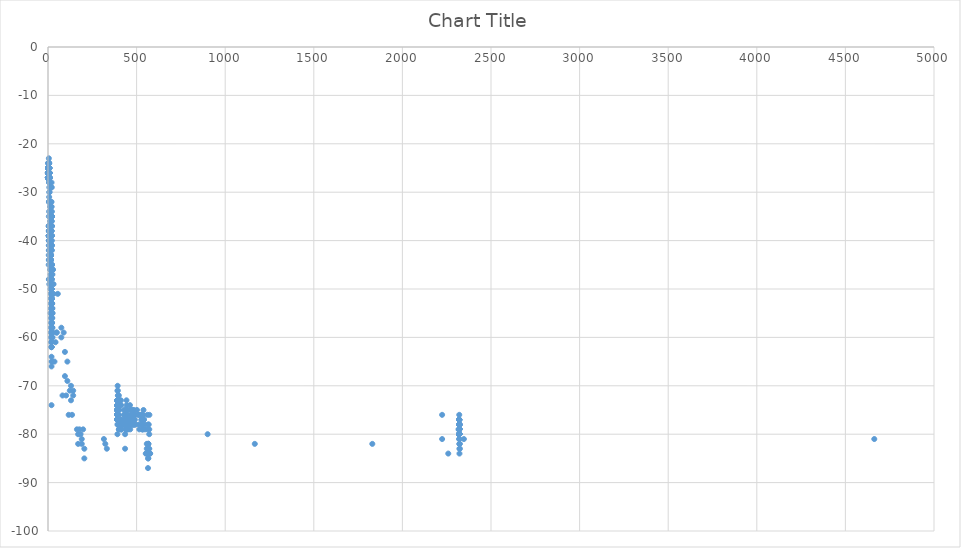
| Category | Series 0 |
|---|---|
| 0.0 | -27 |
| 0.0 | -27 |
| 0.0 | -27 |
| 0.0 | -27 |
| 0.0 | -27 |
| 0.0 | -27 |
| 0.0 | -27 |
| 0.0 | -27 |
| 0.0 | -27 |
| 0.0 | -27 |
| 0.0 | -27 |
| 0.0 | -27 |
| 0.0 | -27 |
| 0.0 | -27 |
| 0.0 | -27 |
| 0.0 | -27 |
| 0.0 | -27 |
| 0.0 | -27 |
| 0.0 | -27 |
| 0.0 | -27 |
| 0.0 | -27 |
| 0.0 | -27 |
| 0.0 | -27 |
| 0.0 | -27 |
| 0.0 | -27 |
| 0.0 | -27 |
| 0.0 | -27 |
| 0.0 | -27 |
| 0.0 | -27 |
| 0.0 | -27 |
| 0.0 | -27 |
| 0.0 | -27 |
| 0.0 | -27 |
| 0.0 | -27 |
| 0.0 | -27 |
| 0.0 | -27 |
| 0.0 | -27 |
| 0.0 | -27 |
| 0.0 | -27 |
| 0.0 | -27 |
| 0.0 | -27 |
| 0.0 | -27 |
| 0.0 | -27 |
| 0.0 | -27 |
| 0.0 | -27 |
| 0.0 | -27 |
| 0.0 | -27 |
| 0.0 | -27 |
| 0.0 | -27 |
| 0.0 | -27 |
| 0.0 | -27 |
| 0.0 | -27 |
| 0.0 | -27 |
| 0.0 | -27 |
| 0.0 | -27 |
| 0.0 | -27 |
| 0.0 | -26 |
| 0.0 | -26 |
| 0.0 | -26 |
| 0.0 | -26 |
| 0.0 | -26 |
| 0.0 | -26 |
| 0.0 | -26 |
| 0.0 | -26 |
| 0.0 | -26 |
| 0.0 | -26 |
| 0.0 | -26 |
| 0.0 | -26 |
| 0.0 | -26 |
| 0.0 | -26 |
| 0.0 | -26 |
| 0.0 | -26 |
| 0.0 | -26 |
| 0.0 | -26 |
| 0.0 | -26 |
| 0.0 | -26 |
| 0.0 | -26 |
| 0.0 | -26 |
| 0.0 | -26 |
| 0.0 | -26 |
| 0.0 | -26 |
| 0.0 | -26 |
| 0.0 | -25 |
| 0.0 | -24 |
| 0.11613462736197669 | -27 |
| 0.11613462736197669 | -27 |
| 0.11613462736197669 | -27 |
| 0.11613462736197669 | -27 |
| 0.11613462736197669 | -27 |
| 0.11613462736197669 | -27 |
| 0.11613462736197669 | -27 |
| 0.11613462736197669 | -27 |
| 0.11613462736197669 | -27 |
| 0.11613462736197669 | -27 |
| 0.11613462736197669 | -27 |
| 0.11613462736197669 | -27 |
| 0.11613462736197669 | -27 |
| 0.11613462736197669 | -27 |
| 0.11613462736197669 | -27 |
| 0.11613462736197669 | -27 |
| 0.11613462736197669 | -27 |
| 0.11613462736197669 | -27 |
| 0.11613462736197669 | -27 |
| 0.11613462736197669 | -27 |
| 0.11613462736197669 | -27 |
| 0.11613462736197669 | -27 |
| 0.11613462736197669 | -27 |
| 0.11613462736197669 | -27 |
| 0.11613462736197669 | -26 |
| 0.11613462736197669 | -25 |
| 0.11613462736197669 | -25 |
| 0.23226925472588353 | -27 |
| 0.23226925472588353 | -27 |
| 0.23226925472588353 | -27 |
| 0.23226925472588353 | -27 |
| 0.23226925472588353 | -27 |
| 0.23226925472588353 | -27 |
| 0.23226925472588353 | -27 |
| 0.23226925472588353 | -27 |
| 0.23226925472588353 | -27 |
| 0.23226925472588353 | -27 |
| 0.23226925472588353 | -27 |
| 0.23226925472588353 | -27 |
| 0.23226925472588353 | -27 |
| 0.23226925472588353 | -27 |
| 0.23226925472588353 | -26 |
| 0.23226925472588353 | -26 |
| 0.23226925472588353 | -26 |
| 0.23226925472588353 | -26 |
| 0.23226925472588353 | -26 |
| 0.23226925472588353 | -26 |
| 0.3484038820897904 | -27 |
| 0.3484038820897904 | -27 |
| 0.3484038820897904 | -27 |
| 0.3484038820897904 | -27 |
| 0.3484038820897904 | -27 |
| 0.3484038820897904 | -27 |
| 0.3484038820897904 | -27 |
| 0.3484038820897904 | -27 |
| 0.3484038820897904 | -27 |
| 0.3484038820897904 | -27 |
| 0.3484038820897904 | -27 |
| 0.3484038820897904 | -27 |
| 0.3484038820897904 | -27 |
| 0.3484038820897904 | -27 |
| 0.3484038820897904 | -27 |
| 0.3484038820897904 | -27 |
| 0.3484038820897904 | -27 |
| 0.3484038820897904 | -27 |
| 0.3484038820897904 | -27 |
| 0.3484038820897904 | -27 |
| 0.3484038820897904 | -27 |
| 0.3484038820897904 | -27 |
| 0.3484038820897904 | -27 |
| 0.3484038820897904 | -27 |
| 0.3484038820897904 | -27 |
| 0.3484038820897904 | -27 |
| 0.3484038820897904 | -27 |
| 0.3484038820897904 | -27 |
| 0.3484038820897904 | -27 |
| 0.3484038820897904 | -27 |
| 0.3484038820897904 | -27 |
| 0.3484038820897904 | -27 |
| 0.3484038820897904 | -27 |
| 0.3484038820897904 | -27 |
| 0.3484038820897904 | -27 |
| 0.3484038820897904 | -27 |
| 0.3484038820897904 | -27 |
| 0.3484038820897904 | -27 |
| 0.3484038820897904 | -27 |
| 0.3484038820897904 | -27 |
| 0.3484038820897904 | -27 |
| 0.3484038820897904 | -27 |
| 0.3484038820897904 | -27 |
| 0.3484038820897904 | -26 |
| 0.3484038820897904 | -26 |
| 0.3484038820897904 | -26 |
| 0.3484038820897904 | -26 |
| 0.3484038820897904 | -26 |
| 0.3484038820897904 | -26 |
| 0.3484038820897904 | -26 |
| 0.3484038820897904 | -26 |
| 0.3484038820897904 | -26 |
| 0.3484038820897904 | -26 |
| 0.3484038820897904 | -26 |
| 0.3484038820897904 | -25 |
| 0.3484038820897904 | -25 |
| 0.3484038820897904 | -25 |
| 0.3484038820897904 | -25 |
| 0.4638430925218141 | -27 |
| 0.4638430925218141 | -27 |
| 0.4638430925218141 | -27 |
| 0.4638430925218141 | -27 |
| 0.4638430925218141 | -27 |
| 0.4638430925218141 | -27 |
| 0.4638430925218141 | -27 |
| 0.4638430925218141 | -27 |
| 0.4638430925218141 | -27 |
| 0.4638430925218141 | -27 |
| 0.4638430925218141 | -27 |
| 0.4638430925218141 | -27 |
| 0.4638430925218141 | -27 |
| 0.4638430925218141 | -27 |
| 0.4638430925218141 | -27 |
| 0.4638430925218141 | -27 |
| 0.4638430925218141 | -27 |
| 0.4638430925218141 | -27 |
| 0.4638430925218141 | -27 |
| 0.4638430925218141 | -27 |
| 0.4638430925218141 | -27 |
| 0.4638430925218141 | -27 |
| 0.4638430925218141 | -27 |
| 0.4638430925218141 | -27 |
| 0.4638430925218141 | -27 |
| 0.4638430925218141 | -26 |
| 0.4638430925218141 | -26 |
| 0.4638430925218141 | -26 |
| 0.4638430925218141 | -26 |
| 0.4638430925218141 | -26 |
| 0.4638430925218141 | -26 |
| 0.4638430925218141 | -26 |
| 0.4638430925218141 | -26 |
| 0.4638430925218141 | -25 |
| 0.966934473998409 | -27 |
| 0.966934473998409 | -27 |
| 0.966934473998409 | -27 |
| 0.966934473998409 | -27 |
| 0.966934473998409 | -27 |
| 0.966934473998409 | -27 |
| 0.966934473998409 | -27 |
| 0.966934473998409 | -27 |
| 0.966934473998409 | -26 |
| 0.966934473998409 | -26 |
| 0.966934473998409 | -26 |
| 1.0273168104516566 | -27 |
| 1.0273168104516566 | -27 |
| 1.0273168104516566 | -27 |
| 1.0273168104516566 | -27 |
| 1.0273168104516566 | -27 |
| 1.0273168104516566 | -27 |
| 1.0273168104516566 | -27 |
| 1.0273168104516566 | -27 |
| 1.0273168104516566 | -27 |
| 1.0273168104516566 | -27 |
| 1.0273168104516566 | -27 |
| 1.0273168104516566 | -27 |
| 1.0273168104516566 | -27 |
| 1.0273168104516566 | -27 |
| 1.0273168104516566 | -27 |
| 1.0273168104516566 | -27 |
| 1.0273168104516566 | -27 |
| 1.0273168104516566 | -27 |
| 1.0273168104516566 | -27 |
| 1.0273168104516566 | -27 |
| 1.0273168104516566 | -27 |
| 1.0273168104516566 | -27 |
| 1.0273168104516566 | -27 |
| 1.0273168104516566 | -27 |
| 1.0273168104516566 | -27 |
| 1.0273168104516566 | -27 |
| 1.0273168104516566 | -27 |
| 1.0273168104516566 | -27 |
| 1.0273168104516566 | -27 |
| 1.0273168104516566 | -27 |
| 1.0273168104516566 | -27 |
| 1.0273168104516566 | -27 |
| 1.0273168104516566 | -27 |
| 1.0273168104516566 | -27 |
| 1.0273168104516566 | -27 |
| 1.0273168104516566 | -27 |
| 1.0273168104516566 | -27 |
| 1.0273168104516566 | -27 |
| 1.0273168104516566 | -27 |
| 1.0273168104516566 | -26 |
| 1.0273168104516566 | -26 |
| 1.0273168104516566 | -26 |
| 1.0273168104516566 | -26 |
| 1.0273168104516566 | -26 |
| 1.0273168104516566 | -26 |
| 1.0273168104516566 | -26 |
| 1.0273168104516566 | -26 |
| 1.0273168104516566 | -26 |
| 1.0273168104516566 | -26 |
| 1.0273168104516566 | -26 |
| 1.0273168104516566 | -26 |
| 1.0273168104516566 | -26 |
| 1.0273168104516566 | -26 |
| 1.0273168104516566 | -26 |
| 1.0273168104516566 | -25 |
| 1.0970034297552893 | -27 |
| 1.0970034297552893 | -27 |
| 1.0970034297552893 | -27 |
| 1.0970034297552893 | -27 |
| 1.0970034297552893 | -27 |
| 1.0970034297552893 | -27 |
| 1.0970034297552893 | -27 |
| 1.0970034297552893 | -27 |
| 1.0970034297552893 | -27 |
| 1.0970034297552893 | -27 |
| 1.0970034297552893 | -27 |
| 1.0970034297552893 | -27 |
| 1.0970034297552893 | -27 |
| 1.0970034297552893 | -27 |
| 1.0970034297552893 | -27 |
| 1.0970034297552893 | -27 |
| 1.0970034297552893 | -27 |
| 1.0970034297552893 | -27 |
| 1.0970034297552893 | -27 |
| 1.0970034297552893 | -26 |
| 1.0970034297552893 | -26 |
| 1.0970034297552893 | -26 |
| 1.0970034297552893 | -26 |
| 1.0970034297552893 | -25 |
| 1.1740646147548526 | -27 |
| 1.1740646147548526 | -27 |
| 1.1740646147548526 | -27 |
| 1.1740646147548526 | -27 |
| 1.1740646147548526 | -27 |
| 1.1740646147548526 | -27 |
| 1.1740646147548526 | -27 |
| 1.1740646147548526 | -27 |
| 1.1740646147548526 | -27 |
| 1.1740646147548526 | -27 |
| 1.1740646147548526 | -27 |
| 1.1740646147548526 | -27 |
| 1.1740646147548526 | -27 |
| 1.1740646147548526 | -27 |
| 1.1740646147548526 | -27 |
| 1.1740646147548526 | -27 |
| 1.1740646147548526 | -27 |
| 1.1740646147548526 | -27 |
| 1.1740646147548526 | -27 |
| 1.1740646147548526 | -27 |
| 1.1740646147548526 | -27 |
| 1.1740646147548526 | -27 |
| 1.1740646147548526 | -27 |
| 1.1740646147548526 | -27 |
| 1.1740646147548526 | -27 |
| 1.1740646147548526 | -26 |
| 1.1740646147548526 | -26 |
| 1.1740646147548526 | -26 |
| 1.1740646147548526 | -26 |
| 1.1740646147548526 | -26 |
| 1.1740646147548526 | -26 |
| 1.1740646147548526 | -26 |
| 1.1740646147548526 | -25 |
| 1.2566318632224815 | -27 |
| 1.2566318632224815 | -27 |
| 1.2566318632224815 | -27 |
| 1.2566318632224815 | -27 |
| 1.2566318632224815 | -27 |
| 1.2566318632224815 | -27 |
| 1.2566318632224815 | -27 |
| 1.2566318632224815 | -27 |
| 1.2566318632224815 | -27 |
| 1.2566318632224815 | -27 |
| 1.2566318632224815 | -27 |
| 1.2566318632224815 | -27 |
| 1.2566318632224815 | -27 |
| 1.2566318632224815 | -27 |
| 1.2566318632224815 | -26 |
| 1.2566318632224815 | -26 |
| 1.2566318632224815 | -26 |
| 1.2566318632224815 | -26 |
| 1.2566318632224815 | -26 |
| 1.2566318632224815 | -26 |
| 1.2566318632224815 | -26 |
| 1.2566318632224815 | -25 |
| 1.3445900149015872 | -27 |
| 1.3445900149015872 | -27 |
| 1.3445900149015872 | -27 |
| 1.3445900149015872 | -27 |
| 1.3445900149015872 | -27 |
| 1.3445900149015872 | -27 |
| 1.3445900149015872 | -27 |
| 1.3445900149015872 | -27 |
| 1.3445900149015872 | -27 |
| 1.3445900149015872 | -27 |
| 1.3445900149015872 | -27 |
| 1.3445900149015872 | -27 |
| 1.3445900149015872 | -27 |
| 1.3445900149015872 | -27 |
| 1.3445900149015872 | -27 |
| 1.3445900149015872 | -27 |
| 1.3445900149015872 | -27 |
| 1.3445900149015872 | -27 |
| 1.3445900149015872 | -27 |
| 1.3445900149015872 | -27 |
| 1.3445900149015872 | -27 |
| 1.3445900149015872 | -27 |
| 1.3445900149015872 | -27 |
| 1.3445900149015872 | -27 |
| 1.3445900149015872 | -27 |
| 1.3445900149015872 | -27 |
| 1.3445900149015872 | -27 |
| 1.3445900149015872 | -27 |
| 1.3445900149015872 | -27 |
| 1.3445900149015872 | -27 |
| 1.3445900149015872 | -27 |
| 1.3445900149015872 | -27 |
| 1.3445900149015872 | -27 |
| 1.3445900149015872 | -27 |
| 1.3445900149015872 | -27 |
| 1.3445900149015872 | -27 |
| 1.3445900149015872 | -27 |
| 1.3445900149015872 | -27 |
| 1.3445900149015872 | -27 |
| 1.3445900149015872 | -27 |
| 1.3445900149015872 | -27 |
| 1.3445900149015872 | -27 |
| 1.3445900149015872 | -27 |
| 1.3445900149015872 | -27 |
| 1.3445900149015872 | -27 |
| 1.3445900149015872 | -27 |
| 1.3445900149015872 | -27 |
| 1.3445900149015872 | -27 |
| 1.3445900149015872 | -27 |
| 1.3445900149015872 | -27 |
| 1.3445900149015872 | -27 |
| 1.3445900149015872 | -27 |
| 1.3445900149015872 | -27 |
| 1.3445900149015872 | -27 |
| 1.3445900149015872 | -27 |
| 1.3445900149015872 | -26 |
| 1.3445900149015872 | -26 |
| 1.3445900149015872 | -26 |
| 1.3445900149015872 | -26 |
| 1.3445900149015872 | -26 |
| 1.3445900149015872 | -26 |
| 1.3445900149015872 | -26 |
| 1.3445900149015872 | -26 |
| 1.3445900149015872 | -26 |
| 1.3445900149015872 | -26 |
| 1.3445900149015872 | -26 |
| 1.3445900149015872 | -26 |
| 1.3445900149015872 | -26 |
| 1.3445900149015872 | -26 |
| 1.3445900149015872 | -26 |
| 1.3445900149015872 | -26 |
| 1.3445900149015872 | -26 |
| 1.3445900149015872 | -26 |
| 1.3445900149015872 | -26 |
| 1.3445900149015872 | -26 |
| 1.3445900149015872 | -26 |
| 1.3445900149015872 | -26 |
| 1.3445900149015872 | -26 |
| 1.3445900149015872 | -26 |
| 1.3445900149015872 | -26 |
| 1.3445900149015872 | -25 |
| 1.3445900149015872 | -25 |
| 1.3445900149015872 | -25 |
| 1.4365568125013888 | -27 |
| 1.4365568125013888 | -27 |
| 1.4365568125013888 | -27 |
| 1.4365568125013888 | -27 |
| 1.4365568125013888 | -27 |
| 1.4365568125013888 | -27 |
| 1.4365568125013888 | -27 |
| 1.4365568125013888 | -27 |
| 1.4365568125013888 | -27 |
| 1.4365568125013888 | -27 |
| 1.4365568125013888 | -27 |
| 1.4365568125013888 | -27 |
| 1.4365568125013888 | -27 |
| 1.4365568125013888 | -27 |
| 1.4365568125013888 | -27 |
| 1.4365568125013888 | -27 |
| 1.4365568125013888 | -27 |
| 1.4365568125013888 | -27 |
| 1.4365568125013888 | -27 |
| 1.4365568125013888 | -27 |
| 1.4365568125013888 | -27 |
| 1.4365568125013888 | -26 |
| 1.4365568125013888 | -26 |
| 1.4365568125013888 | -26 |
| 1.4365568125013888 | -26 |
| 1.4365568125013888 | -26 |
| 1.4365568125013888 | -26 |
| 1.4365568125013888 | -26 |
| 1.4365568125013888 | -26 |
| 1.4365568125013888 | -26 |
| 1.4365568125013888 | -26 |
| 1.4365568125013888 | -26 |
| 1.4365568125013888 | -26 |
| 1.4365568125013888 | -26 |
| 1.4365568125013888 | -25 |
| 1.5318104131302868 | -27 |
| 1.5318104131302868 | -27 |
| 2.1227054827104457 | -27 |
| 2.1227054827104457 | -27 |
| 2.1227054827104457 | -27 |
| 2.1227054827104457 | -27 |
| 2.1227054827104457 | -27 |
| 2.1227054827104457 | -27 |
| 2.1227054827104457 | -27 |
| 2.1227054827104457 | -27 |
| 2.1227054827104457 | -27 |
| 2.1227054827104457 | -27 |
| 2.1227054827104457 | -27 |
| 2.1227054827104457 | -26 |
| 2.1227054827104457 | -26 |
| 2.1227054827104457 | -26 |
| 2.1227054827104457 | -26 |
| 2.1227054827104457 | -26 |
| 2.1227054827104457 | -26 |
| 2.1940067862653345 | -27 |
| 2.1940067862653345 | -27 |
| 2.1940067862653345 | -27 |
| 2.1940067862653345 | -27 |
| 2.1940067862653345 | -27 |
| 2.1940067862653345 | -27 |
| 2.1940067862653345 | -27 |
| 2.1940067862653345 | -27 |
| 2.1940067862653345 | -27 |
| 2.1940067862653345 | -27 |
| 2.1940067862653345 | -27 |
| 2.1940067862653345 | -27 |
| 2.1940067862653345 | -27 |
| 2.1940067862653345 | -27 |
| 2.1940067862653345 | -26 |
| 2.1940067862653345 | -26 |
| 2.1940067862653345 | -25 |
| 2.1940067862653345 | -24 |
| 2.2689436757611308 | -27 |
| 2.2689436757611308 | -27 |
| 2.2689436757611308 | -26 |
| 2.2689436757611308 | -26 |
| 2.2689436757611308 | -26 |
| 2.2689436757611308 | -26 |
| 2.2689436757611308 | -26 |
| 2.2689436757611308 | -26 |
| 2.2689436757611308 | -25 |
| 2.3476484954825767 | -27 |
| 2.3476484954825767 | -27 |
| 2.3476484954825767 | -27 |
| 2.3476484954825767 | -27 |
| 2.3476484954825767 | -27 |
| 2.3476484954825767 | -27 |
| 2.3476484954825767 | -27 |
| 2.3476484954825767 | -27 |
| 2.3476484954825767 | -26 |
| 2.3476484954825767 | -26 |
| 2.3476484954825767 | -26 |
| 2.4293571181053197 | -27 |
| 2.4293571181053197 | -27 |
| 2.4293571181053197 | -27 |
| 2.4293571181053197 | -27 |
| 2.4293571181053197 | -27 |
| 2.4293571181053197 | -27 |
| 2.4293571181053197 | -27 |
| 2.4293571181053197 | -27 |
| 2.4293571181053197 | -26 |
| 2.4293571181053197 | -26 |
| 2.4293571181053197 | -26 |
| 2.5137766509002746 | -27 |
| 2.5137766509002746 | -27 |
| 2.5137766509002746 | -27 |
| 2.5137766509002746 | -27 |
| 2.5137766509002746 | -27 |
| 2.5137766509002746 | -26 |
| 2.5137766509002746 | -26 |
| 2.5137766509002746 | -26 |
| 2.5137766509002746 | -26 |
| 2.5137766509002746 | -25 |
| 2.600643110525304 | -27 |
| 2.600643110525304 | -27 |
| 2.600643110525304 | -27 |
| 2.600643110525304 | -27 |
| 2.600643110525304 | -27 |
| 2.600643110525304 | -27 |
| 2.600643110525304 | -27 |
| 2.600643110525304 | -27 |
| 2.600643110525304 | -26 |
| 2.600643110525304 | -26 |
| 2.600643110525304 | -26 |
| 2.689719431542304 | -27 |
| 2.689719431542304 | -27 |
| 2.689719431542304 | -27 |
| 2.689719431542304 | -27 |
| 2.689719431542304 | -27 |
| 2.689719431542304 | -27 |
| 2.689719431542304 | -27 |
| 2.689719431542304 | -27 |
| 2.689719431542304 | -27 |
| 2.689719431542304 | -26 |
| 2.689719431542304 | -26 |
| 2.689719431542304 | -26 |
| 2.689719431542304 | -25 |
| 2.7796915016768575 | -27 |
| 2.7796915016768575 | -27 |
| 2.7796915016768575 | -27 |
| 2.7796915016768575 | -27 |
| 2.7796915016768575 | -27 |
| 2.7796915016768575 | -27 |
| 2.7796915016768575 | -27 |
| 2.7796915016768575 | -26 |
| 2.7796915016768575 | -26 |
| 2.7796915016768575 | -26 |
| 2.8725523176289207 | -27 |
| 2.8725523176289207 | -27 |
| 2.8725523176289207 | -27 |
| 2.8725523176289207 | -27 |
| 2.8725523176289207 | -27 |
| 2.8725523176289207 | -27 |
| 2.8725523176289207 | -27 |
| 2.8725523176289207 | -27 |
| 2.8725523176289207 | -26 |
| 2.8725523176289207 | -26 |
| 2.8725523176289207 | -25 |
| 2.9670529629429976 | -27 |
| 2.9670529629429976 | -27 |
| 2.9670529629429976 | -27 |
| 2.9670529629429976 | -27 |
| 2.9670529629429976 | -27 |
| 2.9670529629429976 | -27 |
| 2.9670529629429976 | -27 |
| 2.9670529629429976 | -27 |
| 2.9670529629429976 | -27 |
| 2.9670529629429976 | -27 |
| 2.9670529629429976 | -26 |
| 2.9670529629429976 | -26 |
| 2.9670529629429976 | -26 |
| 3.0630416658435307 | -27 |
| 3.0630416658435307 | -27 |
| 3.0630416658435307 | -27 |
| 3.0630416658435307 | -27 |
| 3.0630416658435307 | -27 |
| 3.0630416658435307 | -27 |
| 3.0630416658435307 | -27 |
| 3.0630416658435307 | -27 |
| 3.0630416658435307 | -27 |
| 3.0630416658435307 | -27 |
| 3.0630416658435307 | -27 |
| 3.0630416658435307 | -26 |
| 3.0630416658435307 | -26 |
| 3.0630416658435307 | -26 |
| 3.0630416658435307 | -26 |
| 3.0630416658435307 | -26 |
| 3.160382841185604 | -27 |
| 3.160382841185604 | -27 |
| 3.160382841185604 | -27 |
| 3.160382841185604 | -27 |
| 3.160382841185604 | -27 |
| 3.160382841185604 | -27 |
| 3.160382841185604 | -27 |
| 3.160382841185604 | -27 |
| 3.160382841185604 | -27 |
| 3.160382841185604 | -26 |
| 3.160382841185604 | -26 |
| 3.160382841185604 | -26 |
| 3.160382841185604 | -26 |
| 3.160382841185604 | -26 |
| 3.2589553009206402 | -27 |
| 3.2589553009206402 | -27 |
| 3.2589553009206402 | -26 |
| 3.2589553009206402 | -26 |
| 3.7801409451632164 | -27 |
| 3.8574074446203808 | -27 |
| 3.8574074446203808 | -27 |
| 3.8768300193587772 | -27 |
| 3.8768300193587772 | -26 |
| 4.0298592462030065 | -45 |
| 4.0298592462030065 | -37 |
| 4.033769641331597 | -25 |
| 4.124517217391539 | -27 |
| 4.124517217391539 | -27 |
| 4.216510586216692 | -24 |
| 4.257203479768284 | -43 |
| 4.403921376187348 | -27 |
| 4.485052443775963 | -39 |
| 4.485052443775963 | -39 |
| 4.498622747954434 | -27 |
| 4.498622747954434 | -27 |
| 4.503688320464772 | -41 |
| 4.503688320464772 | -38 |
| 4.5765647197385375 | -27 |
| 4.599142763904997 | -44 |
| 4.599142763904997 | -37 |
| 4.690229249807549 | -27 |
| 4.690229249807549 | -27 |
| 4.690229249807549 | -27 |
| 4.7119648313565445 | -40 |
| 4.7119648313565445 | -39 |
| 4.719652683226004 | -42 |
| 4.783608476488872 | -39 |
| 4.788190734162122 | -40 |
| 4.788190734162122 | -26 |
| 4.807598837282424 | -27 |
| 4.807598837282424 | -27 |
| 4.807598837282424 | -27 |
| 4.807598837282424 | -26 |
| 4.807598837282424 | -26 |
| 4.807598837282424 | -26 |
| 4.807598837282424 | -26 |
| 4.807598837282424 | -23 |
| 4.8262459301134255 | -39 |
| 4.828202530241875 | -37 |
| 4.828202530241875 | -35 |
| 4.836915809873251 | -27 |
| 4.836915809873251 | -27 |
| 4.836915809873251 | -27 |
| 4.836915809873251 | -27 |
| 4.836915809873251 | -27 |
| 4.836915809873251 | -27 |
| 4.836915809873251 | -27 |
| 4.836915809873251 | -27 |
| 4.836915809873251 | -27 |
| 4.836915809873251 | -27 |
| 4.836915809873251 | -27 |
| 4.836915809873251 | -27 |
| 4.836915809873251 | -27 |
| 4.836915809873251 | -27 |
| 4.836915809873251 | -27 |
| 4.836915809873251 | -27 |
| 4.836915809873251 | -27 |
| 4.836915809873251 | -27 |
| 4.836915809873251 | -27 |
| 4.836915809873251 | -27 |
| 4.836915809873251 | -27 |
| 4.836915809873251 | -27 |
| 4.836915809873251 | -27 |
| 4.836915809873251 | -27 |
| 4.836915809873251 | -27 |
| 4.836915809873251 | -27 |
| 4.836915809873251 | -27 |
| 4.836915809873251 | -27 |
| 4.836915809873251 | -27 |
| 4.836915809873251 | -27 |
| 4.836915809873251 | -27 |
| 4.836915809873251 | -27 |
| 4.836915809873251 | -27 |
| 4.836915809873251 | -27 |
| 4.836915809873251 | -27 |
| 4.836915809873251 | -27 |
| 4.836915809873251 | -27 |
| 4.836915809873251 | -27 |
| 4.836915809873251 | -27 |
| 4.836915809873251 | -27 |
| 4.836915809873251 | -27 |
| 4.836915809873251 | -27 |
| 4.836915809873251 | -27 |
| 4.836915809873251 | -27 |
| 4.836915809873251 | -27 |
| 4.836915809873251 | -27 |
| 4.836915809873251 | -27 |
| 4.836915809873251 | -27 |
| 4.836915809873251 | -27 |
| 4.836915809873251 | -27 |
| 4.836915809873251 | -27 |
| 4.836915809873251 | -27 |
| 4.836915809873251 | -27 |
| 4.836915809873251 | -27 |
| 4.836915809873251 | -27 |
| 4.836915809873251 | -27 |
| 4.836915809873251 | -27 |
| 4.836915809873251 | -27 |
| 4.836915809873251 | -27 |
| 4.836915809873251 | -27 |
| 4.836915809873251 | -27 |
| 4.836915809873251 | -27 |
| 4.836915809873251 | -27 |
| 4.836915809873251 | -27 |
| 4.836915809873251 | -26 |
| 4.836915809873251 | -26 |
| 4.836915809873251 | -26 |
| 4.836915809873251 | -26 |
| 4.836915809873251 | -26 |
| 4.836915809873251 | -26 |
| 4.836915809873251 | -26 |
| 4.836915809873251 | -26 |
| 4.836915809873251 | -26 |
| 4.836915809873251 | -26 |
| 4.836915809873251 | -26 |
| 4.836915809873251 | -26 |
| 4.836915809873251 | -26 |
| 4.836915809873251 | -26 |
| 4.836915809873251 | -26 |
| 4.836915809873251 | -26 |
| 4.836915809873251 | -26 |
| 4.836915809873251 | -26 |
| 4.836915809873251 | -26 |
| 4.836915809873251 | -26 |
| 4.836915809873251 | -26 |
| 4.836915809873251 | -26 |
| 4.836915809873251 | -26 |
| 4.836915809873251 | -26 |
| 4.836915809873251 | -26 |
| 4.836915809873251 | -26 |
| 4.836915809873251 | -26 |
| 4.836915809873251 | -26 |
| 4.836915809873251 | -26 |
| 4.836915809873251 | -26 |
| 4.836915809873251 | -26 |
| 4.836915809873251 | -26 |
| 4.836915809873251 | -26 |
| 4.836915809873251 | -26 |
| 4.836915809873251 | -26 |
| 4.836915809873251 | -26 |
| 4.836915809873251 | -26 |
| 4.836915809873251 | -26 |
| 4.836915809873251 | -26 |
| 4.836915809873251 | -26 |
| 4.836915809873251 | -26 |
| 4.836915809873251 | -26 |
| 4.836915809873251 | -26 |
| 4.836915809873251 | -26 |
| 4.836915809873251 | -26 |
| 4.836915809873251 | -26 |
| 4.836915809873251 | -26 |
| 4.836915809873251 | -26 |
| 4.836915809873251 | -25 |
| 4.836915809873251 | -25 |
| 4.867223095301796 | -39 |
| 4.886948443309584 | -26 |
| 4.886948443309584 | -26 |
| 4.902854494014818 | -25 |
| 4.940614194774649 | -39 |
| 4.940614194774649 | -39 |
| 4.986455069318477 | -27 |
| 4.992872273241673 | -27 |
| 4.992872273241673 | -26 |
| 5.0450056216269825 | -38 |
| 5.055063002984746 | -37 |
| 5.055063819231758 | -48 |
| 5.055063819231758 | -40 |
| 5.08666666088886 | -39 |
| 5.08666666088886 | -27 |
| 5.169587841114874 | -26 |
| 5.169587841114874 | -26 |
| 5.2028181965479305 | -26 |
| 5.209744472640164 | -32 |
| 5.209744472640164 | -32 |
| 5.284182168069767 | -26 |
| 5.288237047169722 | -27 |
| 5.288237047169722 | -27 |
| 5.288237047169722 | -26 |
| 5.30908058701891 | -26 |
| 5.30908058701891 | -24 |
| 5.331066187823553 | -27 |
| 5.331066187823553 | -27 |
| 5.331066187823553 | -26 |
| 5.389910710123769 | -39 |
| 5.389910710123769 | -38 |
| 5.398155547897567 | -26 |
| 5.398155547897567 | -25 |
| 5.415748395848854 | -27 |
| 5.415748395848854 | -27 |
| 5.5626400256213815 | -24 |
| 5.740940336674183 | -25 |
| 5.744542906482917 | -27 |
| 5.744542906482917 | -26 |
| 5.838648559887481 | -27 |
| 5.844732633262492 | -48 |
| 5.856686766952914 | -27 |
| 5.856686766952914 | -27 |
| 5.856686766952914 | -27 |
| 5.856686766952914 | -26 |
| 5.933534805894837 | -27 |
| 5.933534805894837 | -27 |
| 5.933534805894837 | -27 |
| 5.933534805894837 | -26 |
| 5.970931700889894 | -27 |
| 5.970931700889894 | -27 |
| 5.970931700889894 | -26 |
| 5.970931700889894 | -26 |
| 5.970931700889894 | -26 |
| 5.970931700889894 | -26 |
| 5.970931700889894 | -26 |
| 6.02916479000809 | -27 |
| 6.02916479000809 | -27 |
| 6.02916479000809 | -27 |
| 6.02916479000809 | -26 |
| 6.02916479000809 | -26 |
| 6.085910337588555 | -26 |
| 6.085910337588555 | -26 |
| 6.085910337588555 | -26 |
| 6.085911329119763 | -44 |
| 6.085911329119763 | -34 |
| 6.125503679109165 | -27 |
| 6.125503679109165 | -27 |
| 6.125503679109165 | -27 |
| 6.125503679109165 | -27 |
| 6.125503679109165 | -26 |
| 6.125503679109165 | -26 |
| 6.125503679109165 | -26 |
| 6.22251854685257 | -27 |
| 6.22251854685257 | -27 |
| 6.22251854685257 | -26 |
| 6.22251854685257 | -26 |
| 6.22251854685257 | -26 |
| 6.22251854685257 | -26 |
| 6.22251854685257 | -26 |
| 6.260809396365446 | -27 |
| 6.260809396365446 | -27 |
| 6.319591615636764 | -27 |
| 6.319591615636764 | -27 |
| 6.319591615636764 | -27 |
| 6.319591615636764 | -27 |
| 6.319591615636764 | -26 |
| 6.319591615636764 | -26 |
| 6.319591615636764 | -26 |
| 6.340262363245557 | -27 |
| 6.372675091524988 | -26 |
| 6.374191583302893 | -27 |
| 6.417272918915533 | -27 |
| 6.417272918915533 | -27 |
| 6.417272918915533 | -27 |
| 6.417272918915533 | -27 |
| 6.417272918915533 | -27 |
| 6.417272918915533 | -27 |
| 6.417272918915533 | -27 |
| 6.417272918915533 | -27 |
| 6.417272918915533 | -26 |
| 6.417272918915533 | -26 |
| 6.417272918915533 | -26 |
| 6.417272918915533 | -26 |
| 6.417272918915533 | -26 |
| 6.417272918915533 | -26 |
| 6.484019697903644 | -27 |
| 6.484019697903644 | -26 |
| 6.484019697903644 | -26 |
| 6.484019697903644 | -24 |
| 6.511174031442668 | -27 |
| 6.516128748537481 | -27 |
| 6.516128748537481 | -27 |
| 6.516128748537481 | -27 |
| 6.516128748537481 | -27 |
| 6.516128748537481 | -27 |
| 6.516128748537481 | -27 |
| 6.516128748537481 | -27 |
| 6.516128748537481 | -27 |
| 6.516128748537481 | -27 |
| 6.516128748537481 | -27 |
| 6.516128748537481 | -27 |
| 6.516128748537481 | -27 |
| 6.516128748537481 | -26 |
| 6.516128748537481 | -26 |
| 6.516128748537481 | -26 |
| 6.516128748537481 | -26 |
| 6.516128748537481 | -26 |
| 6.516128748537481 | -26 |
| 6.516128748537481 | -26 |
| 6.516128748537481 | -25 |
| 6.596177107398889 | -27 |
| 6.596177107398889 | -26 |
| 6.615546122927653 | -27 |
| 6.615546122927653 | -27 |
| 6.615546122927653 | -27 |
| 6.615546122927653 | -27 |
| 6.615546122927653 | -27 |
| 6.615546122927653 | -27 |
| 6.615546122927653 | -27 |
| 6.615546122927653 | -27 |
| 6.615546122927653 | -27 |
| 6.615546122927653 | -27 |
| 6.615546122927653 | -27 |
| 6.615546122927653 | -26 |
| 6.615546122927653 | -26 |
| 6.615546122927653 | -26 |
| 6.615546122927653 | -26 |
| 6.615546122927653 | -26 |
| 6.615546122927653 | -26 |
| 6.615546122927653 | -26 |
| 6.615546122927653 | -26 |
| 6.615546122927653 | -26 |
| 6.615546122927653 | -26 |
| 6.715500102530678 | -27 |
| 6.715500102530678 | -27 |
| 6.715500102530678 | -27 |
| 6.715500102530678 | -27 |
| 6.715500102530678 | -27 |
| 6.715500102530678 | -27 |
| 6.715500102530678 | -27 |
| 6.715500102530678 | -27 |
| 6.715500102530678 | -27 |
| 6.715500102530678 | -27 |
| 6.715500102530678 | -26 |
| 6.715500102530678 | -26 |
| 6.715500102530678 | -26 |
| 6.715500102530678 | -26 |
| 6.715500102530678 | -26 |
| 6.715500102530678 | -26 |
| 6.717648501933499 | -31 |
| 6.717648501933499 | -27 |
| 6.815363999380056 | -27 |
| 6.815363999380056 | -27 |
| 6.815363999380056 | -27 |
| 6.815363999380056 | -27 |
| 6.815363999380056 | -27 |
| 6.815363999380056 | -27 |
| 6.815363999380056 | -27 |
| 6.815363999380056 | -27 |
| 6.815363999380056 | -27 |
| 6.815363999380056 | -27 |
| 6.815363999380056 | -27 |
| 6.863570876209855 | -27 |
| 6.863570876209855 | -27 |
| 6.863570876209855 | -27 |
| 6.863570876209855 | -26 |
| 6.863570876209855 | -26 |
| 6.863570876209855 | -26 |
| 6.863570876209855 | -26 |
| 6.863570876209855 | -25 |
| 6.916318747247265 | -27 |
| 6.916318747247265 | -27 |
| 6.916318747247265 | -27 |
| 6.916318747247265 | -27 |
| 6.916318747247265 | -27 |
| 6.916318747247265 | -27 |
| 6.916318747247265 | -27 |
| 6.916318747247265 | -27 |
| 6.916318747247265 | -27 |
| 6.916318747247265 | -27 |
| 6.916318747247265 | -27 |
| 6.916318747247265 | -27 |
| 6.916318747247265 | -27 |
| 6.916318747247265 | -27 |
| 6.916318747247265 | -27 |
| 6.916318747247265 | -27 |
| 6.916318747247265 | -27 |
| 6.916318747247265 | -27 |
| 6.916318747247265 | -27 |
| 6.916318747247265 | -27 |
| 6.916318747247265 | -27 |
| 6.916318747247265 | -26 |
| 6.916318747247265 | -26 |
| 6.916318747247265 | -26 |
| 6.916318747247265 | -26 |
| 6.916318747247265 | -26 |
| 6.916318747247265 | -26 |
| 6.916318747247265 | -26 |
| 6.916318747247265 | -26 |
| 6.916318747247265 | -26 |
| 6.916318747247265 | -26 |
| 6.916318747247265 | -26 |
| 6.916318747247265 | -26 |
| 6.916318747247265 | -26 |
| 6.916318747247265 | -26 |
| 6.916318747247265 | -26 |
| 6.916318747247265 | -26 |
| 6.916318747247265 | -26 |
| 6.916318747247265 | -26 |
| 6.916318747247265 | -26 |
| 6.916318747247265 | -25 |
| 6.916318747247265 | -25 |
| 6.970910552495951 | -27 |
| 6.970910552495951 | -26 |
| 6.970910552495951 | -25 |
| 6.985154045335941 | -32 |
| 6.985154045335941 | -28 |
| 7.017743089371446 | -28 |
| 7.017743089371446 | -27 |
| 7.017743089371446 | -27 |
| 7.017743089371446 | -27 |
| 7.017743089371446 | -27 |
| 7.017743089371446 | -27 |
| 7.017743089371446 | -27 |
| 7.017743089371446 | -27 |
| 7.017743089371446 | -27 |
| 7.017743089371446 | -27 |
| 7.017743089371446 | -27 |
| 7.017743089371446 | -27 |
| 7.017743089371446 | -27 |
| 7.017743089371446 | -27 |
| 7.017743089371446 | -27 |
| 7.017743089371446 | -27 |
| 7.017743089371446 | -27 |
| 7.017743089371446 | -26 |
| 7.017743089371446 | -26 |
| 7.017743089371446 | -26 |
| 7.017743089371446 | -26 |
| 7.017743089371446 | -26 |
| 7.017743089371446 | -26 |
| 7.017743089371446 | -26 |
| 7.017743089371446 | -26 |
| 7.017743089371446 | -26 |
| 7.017743089371446 | -26 |
| 7.017743089371446 | -26 |
| 7.017743089371446 | -26 |
| 7.017743089371446 | -26 |
| 7.017743089371446 | -26 |
| 7.017743089371446 | -26 |
| 7.017743089371446 | -26 |
| 7.017743089371446 | -26 |
| 7.017743089371446 | -26 |
| 7.017743089371446 | -26 |
| 7.017743089371446 | -25 |
| 7.017743089371446 | -25 |
| 7.079154054859077 | -27 |
| 7.079154054859077 | -27 |
| 7.119005633751143 | -27 |
| 7.119005633751143 | -27 |
| 7.119005633751143 | -27 |
| 7.119005633751143 | -27 |
| 7.119005633751143 | -27 |
| 7.119005633751143 | -27 |
| 7.119005633751143 | -27 |
| 7.119005633751143 | -27 |
| 7.119005633751143 | -27 |
| 7.119005633751143 | -27 |
| 7.119005633751143 | -27 |
| 7.119005633751143 | -27 |
| 7.119005633751143 | -26 |
| 7.119005633751143 | -26 |
| 7.119005633751143 | -26 |
| 7.119005633751143 | -26 |
| 7.119005633751143 | -26 |
| 7.119005633751143 | -26 |
| 7.119005633751143 | -26 |
| 7.119005633751143 | -26 |
| 7.119005633751143 | -26 |
| 7.119005633751143 | -26 |
| 7.119005633751143 | -26 |
| 7.119005633751143 | -26 |
| 7.119005633751143 | -25 |
| 7.119005633751143 | -25 |
| 7.119005633751143 | -25 |
| 7.221307479622302 | -27 |
| 7.221307479622302 | -27 |
| 7.221307479622302 | -27 |
| 7.221307479622302 | -27 |
| 7.221307479622302 | -26 |
| 7.221307479622302 | -24 |
| 7.2603108666027705 | -42 |
| 7.2603108666027705 | -41 |
| 7.2603108666027705 | -27 |
| 7.2603108666027705 | -26 |
| 7.323405644006013 | -27 |
| 7.323405644006013 | -27 |
| 7.323405644006013 | -27 |
| 7.323405644006013 | -27 |
| 7.323405644006013 | -27 |
| 7.323405644006013 | -27 |
| 7.323405644006013 | -27 |
| 7.323405644006013 | -27 |
| 7.323405644006013 | -27 |
| 7.323405644006013 | -27 |
| 7.323405644006013 | -26 |
| 7.323405644006013 | -26 |
| 7.323405644006013 | -26 |
| 7.323405644006013 | -26 |
| 7.323405644006013 | -26 |
| 7.350311863044565 | -49 |
| 7.380109707974207 | -28 |
| 7.42651319095977 | -27 |
| 7.42651319095977 | -27 |
| 7.42651319095977 | -27 |
| 7.42651319095977 | -27 |
| 7.42651319095977 | -27 |
| 7.42651319095977 | -26 |
| 7.42651319095977 | -26 |
| 7.42651319095977 | -26 |
| 7.42651319095977 | -26 |
| 7.42651319095977 | -26 |
| 7.42651319095977 | -26 |
| 7.42651319095977 | -26 |
| 7.42651319095977 | -26 |
| 7.42651319095977 | -26 |
| 7.42651319095977 | -25 |
| 7.465682299901366 | -30 |
| 7.465682299901366 | -29 |
| 7.530000040488598 | -27 |
| 7.530000040488598 | -27 |
| 7.530000040488598 | -27 |
| 7.530000040488598 | -27 |
| 7.530000040488598 | -26 |
| 7.530000040488598 | -26 |
| 7.530000040488598 | -26 |
| 7.530000040488598 | -26 |
| 7.530000040488598 | -26 |
| 7.530000040488598 | -26 |
| 7.530000040488598 | -26 |
| 7.530000040488598 | -26 |
| 7.633850766776172 | -27 |
| 7.633850766776172 | -27 |
| 7.633850766776172 | -27 |
| 7.633850766776172 | -27 |
| 7.633850766776172 | -27 |
| 7.633850766776172 | -27 |
| 7.633850766776172 | -27 |
| 7.633850766776172 | -27 |
| 7.633850766776172 | -27 |
| 7.633850766776172 | -27 |
| 7.633850766776172 | -26 |
| 7.633850766776172 | -26 |
| 7.633850766776172 | -26 |
| 7.633850766776172 | -26 |
| 7.633850766776172 | -25 |
| 7.804784971603791 | -40 |
| 8.528239318051835 | -30 |
| 9.93766448220478 | -27 |
| 10.368646123304293 | -43 |
| 10.368646123304293 | -43 |
| 11.7066694626167 | -48 |
| 11.7066694626167 | -33 |
| 11.875167617710604 | -42 |
| 12.393542878383222 | -36 |
| 12.55010868863354 | -44 |
| 13.534109649805833 | -42 |
| 13.534109649805833 | -35 |
| 14.030740636609748 | -40 |
| 14.343099831028624 | -41 |
| 14.343099831028624 | -36 |
| 14.343099831028624 | -34 |
| 14.381508199952982 | -50 |
| 14.381508199952982 | -44 |
| 14.419832945802366 | -55 |
| 14.420302463979343 | -48 |
| 14.420302463979343 | -48 |
| 14.420302463979343 | -47 |
| 14.420302463979343 | -43 |
| 14.459925406966397 | -46 |
| 14.459925406966397 | -46 |
| 14.459925406966397 | -45 |
| 14.459925406966397 | -45 |
| 14.459925406966397 | -44 |
| 14.459925406966397 | -43 |
| 14.459925406966397 | -43 |
| 14.459925406966397 | -42 |
| 14.459925406966397 | -42 |
| 14.459925406966397 | -42 |
| 14.459925406966397 | -42 |
| 14.459925406966397 | -42 |
| 14.459925406966397 | -42 |
| 14.459925406966397 | -41 |
| 14.459925406966397 | -41 |
| 14.459925406966397 | -41 |
| 14.459925406966397 | -41 |
| 14.459925406966397 | -41 |
| 14.459925406966397 | -41 |
| 14.459925406966397 | -41 |
| 14.459925406966397 | -41 |
| 14.459925406966397 | -41 |
| 14.459925406966397 | -40 |
| 14.459925406966397 | -40 |
| 14.459925406966397 | -40 |
| 14.459925406966397 | -40 |
| 14.459925406966397 | -40 |
| 14.459925406966397 | -40 |
| 14.500370235702462 | -48 |
| 14.500370235702462 | -46 |
| 14.500370235702462 | -46 |
| 14.500370235702462 | -46 |
| 14.500370235702462 | -45 |
| 14.500370235702462 | -45 |
| 14.500370235702462 | -44 |
| 14.500370235702462 | -44 |
| 14.500370235702462 | -43 |
| 14.500370235702462 | -42 |
| 14.500370235702462 | -42 |
| 14.500370235702462 | -42 |
| 14.500370235702462 | -42 |
| 14.500370235702462 | -42 |
| 14.500370235702462 | -42 |
| 14.500370235702462 | -42 |
| 14.500370235702462 | -41 |
| 14.500370235702462 | -41 |
| 14.500370235702462 | -41 |
| 14.500370235702462 | -41 |
| 14.500370235702462 | -41 |
| 14.500370235702462 | -41 |
| 14.500370235702462 | -40 |
| 14.500370235702462 | -40 |
| 14.500370235702462 | -40 |
| 14.500370235702462 | -40 |
| 14.500370235702462 | -40 |
| 14.541131167509528 | -44 |
| 14.541131167509528 | -34 |
| 14.54138061547894 | -44 |
| 14.54138061547894 | -42 |
| 14.54138061547894 | -42 |
| 14.54138061547894 | -42 |
| 14.54138061547894 | -41 |
| 14.54138061547894 | -41 |
| 14.54138061547894 | -40 |
| 14.54138061547894 | -40 |
| 14.583189497824051 | -42 |
| 14.583189497824051 | -42 |
| 14.625531048828762 | -48 |
| 14.626049049665598 | -42 |
| 14.626049049665598 | -42 |
| 14.626049049665598 | -42 |
| 14.669702800399604 | -43 |
| 14.669702800399604 | -42 |
| 14.714143681366835 | -42 |
| 14.714143681366835 | -41 |
| 14.759091491231757 | -42 |
| 14.759091491231757 | -42 |
| 14.759091491231757 | -41 |
| 14.8050806582107 | -42 |
| 14.8050806582107 | -42 |
| 14.8050806582107 | -41 |
| 15.113765943125692 | -40 |
| 15.113765943125692 | -37 |
| 15.113765943125692 | -37 |
| 15.113765943125692 | -36 |
| 15.113765943125692 | -34 |
| 15.113765943125692 | -33 |
| 15.148479203708384 | -36 |
| 15.148479203708384 | -33 |
| 15.148479203708384 | -33 |
| 15.148479203708384 | -33 |
| 15.148479203708384 | -32 |
| 15.148479203708384 | -32 |
| 15.221597581855095 | -45 |
| 15.221597581855095 | -44 |
| 15.221597581855095 | -44 |
| 15.221597581855095 | -41 |
| 15.586607230434293 | -43 |
| 15.586607230434293 | -42 |
| 15.586607230434293 | -42 |
| 15.586607230434293 | -42 |
| 15.631024643663432 | -43 |
| 15.631024643663432 | -43 |
| 15.631024643663432 | -42 |
| 15.631024643663432 | -42 |
| 15.631024643663432 | -42 |
| 15.631024643663432 | -42 |
| 15.631024643663432 | -42 |
| 15.631024643663432 | -41 |
| 15.675904044413455 | -41 |
| 15.675904044413455 | -40 |
| 15.72150299132897 | -40 |
| 15.768096380067982 | -42 |
| 15.768096380067982 | -42 |
| 15.815405311763802 | -42 |
| 15.912144178661705 | -42 |
| 15.961561259018183 | -41 |
| 15.961561259018183 | -41 |
| 16.01106403992063 | -41 |
| 16.061846197230587 | -44 |
| 16.061846197230587 | -42 |
| 16.209620251292126 | -35 |
| 16.239066681460134 | -35 |
| 16.239066681460134 | -35 |
| 16.26928883709992 | -35 |
| 16.30028240342207 | -35 |
| 16.332042988673276 | -38 |
| 16.332042988673276 | -36 |
| 16.332042988673276 | -35 |
| 16.332042988673276 | -35 |
| 16.364172134488474 | -36 |
| 16.364172134488474 | -35 |
| 16.466665146795698 | -44 |
| 16.466665146795698 | -42 |
| 16.575012389068007 | -46 |
| 16.68987259359112 | -41 |
| 17.032375447128636 | -35 |
| 17.060401857064086 | -35 |
| 17.060401857064086 | -35 |
| 17.060401857064086 | -35 |
| 17.1196130677302 | -40 |
| 17.1196130677302 | -40 |
| 17.1196130677302 | -37 |
| 17.213152466266326 | -39 |
| 17.213152466266326 | -39 |
| 17.261179692941184 | -42 |
| 17.261179692941184 | -39 |
| 17.261179692941184 | -39 |
| 17.261179692941184 | -37 |
| 17.30985284580233 | -43 |
| 17.30985284580233 | -43 |
| 17.30985284580233 | -42 |
| 17.30985284580233 | -41 |
| 17.30985284580233 | -41 |
| 17.30985284580233 | -40 |
| 17.359166491536378 | -45 |
| 17.359166491536378 | -43 |
| 17.459693482841747 | -44 |
| 17.490502364029087 | -47 |
| 17.490502364029087 | -45 |
| 17.56707327721605 | -50 |
| 17.78207770402343 | -35 |
| 17.806217706529292 | -35 |
| 17.806217706529292 | -35 |
| 17.806217706529292 | -35 |
| 17.900591646895187 | -42 |
| 17.900591646895187 | -38 |
| 17.900591646895187 | -37 |
| 17.900591646895187 | -36 |
| 17.900591646895187 | -35 |
| 17.94474619021405 | -39 |
| 17.94474619021405 | -38 |
| 17.94474619021405 | -37 |
| 17.94474619021405 | -37 |
| 17.94474619021405 | -37 |
| 17.94474619021405 | -37 |
| 17.94474619021405 | -37 |
| 17.94474619021405 | -35 |
| 18.082616966348894 | -38 |
| 18.082616966348894 | -38 |
| 18.082616966348894 | -36 |
| 18.1298288015441 | -38 |
| 18.1298288015441 | -38 |
| 18.1298288015441 | -38 |
| 18.1298288015441 | -35 |
| 18.17765999752631 | -38 |
| 18.17765999752631 | -37 |
| 18.17765999752631 | -35 |
| 18.17765999752631 | -35 |
| 18.17765999752631 | -33 |
| 18.17765999752631 | -33 |
| 18.22610567808635 | -36 |
| 18.27456988066017 | -37 |
| 18.27456988066017 | -35 |
| 18.27456988066017 | -34 |
| 18.287357336834493 | -52 |
| 18.287357336834493 | -52 |
| 18.287357336834493 | -51 |
| 18.324222648142825 | -53 |
| 18.324222648142825 | -52 |
| 18.324222648142825 | -51 |
| 18.324222648142825 | -50 |
| 18.324222648142825 | -49 |
| 18.324222648142825 | -49 |
| 18.324222648142825 | -49 |
| 18.324222648142825 | -49 |
| 18.324222648142825 | -48 |
| 18.37447527373207 | -53 |
| 18.42532284932982 | -50 |
| 18.42532284932982 | -49 |
| 18.42532284932982 | -49 |
| 18.476760463073962 | -53 |
| 18.476760463073962 | -53 |
| 18.476760463073962 | -52 |
| 18.476760463073962 | -52 |
| 18.476760463073962 | -52 |
| 18.476760463073962 | -51 |
| 18.476760463073962 | -51 |
| 18.476760463073962 | -51 |
| 18.476760463073962 | -49 |
| 18.476760463073962 | -49 |
| 18.48283119233545 | -51 |
| 18.52580853340284 | -35 |
| 18.52580853340284 | -35 |
| 18.52580853340284 | -35 |
| 18.52580853340284 | -35 |
| 18.52580853340284 | -35 |
| 18.528783200963076 | -53 |
| 18.528783200963076 | -52 |
| 18.528783200963076 | -52 |
| 18.528783200963076 | -51 |
| 18.528783200963076 | -51 |
| 18.528783200963076 | -49 |
| 18.546506522434427 | -35 |
| 18.546506522434427 | -35 |
| 18.546506522434427 | -35 |
| 18.567907829284735 | -35 |
| 18.567907829284735 | -35 |
| 18.567907829284735 | -35 |
| 18.567907829284735 | -35 |
| 18.58106944370153 | -58 |
| 18.58106944370153 | -57 |
| 18.58106944370153 | -56 |
| 18.58106944370153 | -56 |
| 18.58106944370153 | -56 |
| 18.58106944370153 | -55 |
| 18.58106944370153 | -55 |
| 18.58106944370153 | -55 |
| 18.58106944370153 | -55 |
| 18.58106944370153 | -55 |
| 18.58106944370153 | -55 |
| 18.58106944370153 | -55 |
| 18.58106944370153 | -55 |
| 18.58106944370153 | -54 |
| 18.58106944370153 | -54 |
| 18.58106944370153 | -54 |
| 18.58106944370153 | -54 |
| 18.58106944370153 | -54 |
| 18.58106944370153 | -54 |
| 18.58106944370153 | -54 |
| 18.58106944370153 | -54 |
| 18.58106944370153 | -54 |
| 18.58106944370153 | -54 |
| 18.58106944370153 | -54 |
| 18.58106944370153 | -54 |
| 18.58106944370153 | -54 |
| 18.58106944370153 | -54 |
| 18.58106944370153 | -54 |
| 18.58106944370153 | -54 |
| 18.58106944370153 | -53 |
| 18.58106944370153 | -53 |
| 18.58106944370153 | -53 |
| 18.58106944370153 | -53 |
| 18.58106944370153 | -53 |
| 18.58106944370153 | -53 |
| 18.58106944370153 | -53 |
| 18.58106944370153 | -53 |
| 18.58106944370153 | -53 |
| 18.58106944370153 | -53 |
| 18.58106944370153 | -53 |
| 18.58106944370153 | -53 |
| 18.58106944370153 | -53 |
| 18.58106944370153 | -53 |
| 18.58106944370153 | -53 |
| 18.58106944370153 | -53 |
| 18.58106944370153 | -53 |
| 18.58106944370153 | -53 |
| 18.58106944370153 | -53 |
| 18.58106944370153 | -53 |
| 18.58106944370153 | -53 |
| 18.58106944370153 | -53 |
| 18.58106944370153 | -53 |
| 18.58106944370153 | -53 |
| 18.58106944370153 | -52 |
| 18.58106944370153 | -52 |
| 18.58106944370153 | -52 |
| 18.58106944370153 | -52 |
| 18.58106944370153 | -52 |
| 18.58106944370153 | -52 |
| 18.58106944370153 | -52 |
| 18.58106944370153 | -51 |
| 18.58106944370153 | -51 |
| 18.58106944370153 | -51 |
| 18.58106944370153 | -51 |
| 18.58106944370153 | -51 |
| 18.58106944370153 | -51 |
| 18.58106944370153 | -50 |
| 18.58106944370153 | -50 |
| 18.58106944370153 | -50 |
| 18.58106944370153 | -50 |
| 18.58106944370153 | -50 |
| 18.58106944370153 | -50 |
| 18.58106944370153 | -50 |
| 18.58106944370153 | -50 |
| 18.590010024919856 | -35 |
| 18.603698467332094 | -50 |
| 18.603698467332094 | -49 |
| 18.603698467332094 | -36 |
| 18.612672008582354 | -35 |
| 18.612672008582354 | -35 |
| 18.633283974631723 | -52 |
| 18.7413196177703 | -53 |
| 18.7413196177703 | -53 |
| 18.7413196177703 | -49 |
| 18.791077020805293 | -41 |
| 18.791077020805293 | -38 |
| 18.79618093043413 | -58 |
| 18.79618093043413 | -55 |
| 18.79618093043413 | -52 |
| 18.79618093043413 | -51 |
| 18.79618093043413 | -50 |
| 18.79618093043413 | -50 |
| 18.85159804140069 | -54 |
| 18.85159804140069 | -53 |
| 18.85159804140069 | -51 |
| 18.907566063620315 | -53 |
| 18.907566063620315 | -52 |
| 18.964080119440517 | -60 |
| 18.964080119440517 | -57 |
| 18.964080119440517 | -56 |
| 18.964080119440517 | -56 |
| 18.964080119440517 | -54 |
| 18.964080119440517 | -54 |
| 18.964080119440517 | -54 |
| 18.964080119440517 | -51 |
| 18.964080119440517 | -51 |
| 18.964080119440517 | -49 |
| 18.999489036795268 | -55 |
| 18.999489036795268 | -54 |
| 18.999489036795268 | -52 |
| 19.002435948150374 | -45 |
| 19.002435948150374 | -45 |
| 19.002435948150374 | -41 |
| 19.020448863128436 | -62 |
| 19.020448863128436 | -61 |
| 19.020448863128436 | -60 |
| 19.020448863128436 | -59 |
| 19.020448863128436 | -59 |
| 19.020448863128436 | -59 |
| 19.020448863128436 | -59 |
| 19.020448863128436 | -58 |
| 19.020448863128436 | -55 |
| 19.020448863128436 | -54 |
| 19.020448863128436 | -54 |
| 19.020448863128436 | -54 |
| 19.020448863128436 | -54 |
| 19.020448863128436 | -54 |
| 19.020448863128436 | -53 |
| 19.020448863128436 | -53 |
| 19.020448863128436 | -52 |
| 19.020448863128436 | -52 |
| 19.020448863128436 | -51 |
| 19.020448863128436 | -50 |
| 19.04598540605291 | -55 |
| 19.04598540605291 | -55 |
| 19.04598540605291 | -54 |
| 19.04598540605291 | -54 |
| 19.04598540605291 | -53 |
| 19.04598540605291 | -53 |
| 19.04598540605291 | -53 |
| 19.04598540605291 | -53 |
| 19.04598540605291 | -53 |
| 19.04598540605291 | -53 |
| 19.04598540605291 | -53 |
| 19.04598540605291 | -53 |
| 19.04598540605291 | -53 |
| 19.04598540605291 | -50 |
| 19.04598540605291 | -49 |
| 19.04598540605291 | -48 |
| 19.093632229753805 | -54 |
| 19.093632229753805 | -54 |
| 19.093632229753805 | -53 |
| 19.093632229753805 | -53 |
| 19.093632229753805 | -53 |
| 19.093632229753805 | -53 |
| 19.093632229753805 | -53 |
| 19.093632229753805 | -53 |
| 19.093632229753805 | -53 |
| 19.093632229753805 | -53 |
| 19.093632229753805 | -53 |
| 19.093632229753805 | -53 |
| 19.093632229753805 | -53 |
| 19.093632229753805 | -53 |
| 19.093632229753805 | -53 |
| 19.093632229753805 | -53 |
| 19.093632229753805 | -53 |
| 19.093632229753805 | -53 |
| 19.093632229753805 | -53 |
| 19.093632229753805 | -53 |
| 19.093632229753805 | -52 |
| 19.093632229753805 | -52 |
| 19.093632229753805 | -51 |
| 19.093632229753805 | -51 |
| 19.093632229753805 | -50 |
| 19.093632229753805 | -50 |
| 19.093632229753805 | -49 |
| 19.093632229753805 | -49 |
| 19.141865059543964 | -55 |
| 19.141865059543964 | -54 |
| 19.141865059543964 | -54 |
| 19.141865059543964 | -54 |
| 19.141865059543964 | -54 |
| 19.141865059543964 | -54 |
| 19.141865059543964 | -54 |
| 19.141865059543964 | -54 |
| 19.141865059543964 | -53 |
| 19.141865059543964 | -53 |
| 19.141865059543964 | -53 |
| 19.141865059543964 | -53 |
| 19.141865059543964 | -53 |
| 19.141865059543964 | -53 |
| 19.141865059543964 | -53 |
| 19.141865059543964 | -53 |
| 19.141865059543964 | -53 |
| 19.141865059543964 | -53 |
| 19.141865059543964 | -53 |
| 19.141865059543964 | -53 |
| 19.141865059543964 | -53 |
| 19.141865059543964 | -53 |
| 19.141865059543964 | -53 |
| 19.141865059543964 | -53 |
| 19.141865059543964 | -53 |
| 19.141865059543964 | -53 |
| 19.141865059543964 | -53 |
| 19.141865059543964 | -53 |
| 19.141865059543964 | -53 |
| 19.141865059543964 | -53 |
| 19.141865059543964 | -52 |
| 19.141865059543964 | -52 |
| 19.141865059543964 | -52 |
| 19.141865059543964 | -51 |
| 19.141865059543964 | -51 |
| 19.141865059543964 | -51 |
| 19.141865059543964 | -51 |
| 19.141865059543964 | -50 |
| 19.141865059543964 | -49 |
| 19.156547540368308 | -42 |
| 19.156547540368308 | -39 |
| 19.16673258028348 | -34 |
| 19.36167546737598 | -35 |
| 19.381480836145656 | -35 |
| 19.422856973956893 | -45 |
| 19.47947925738073 | -53 |
| 19.56173765230533 | -52 |
| 19.56173765230533 | -49 |
| 19.646881924571304 | -53 |
| 19.69034346952273 | -49 |
| 19.69034346952273 | -47 |
| 19.734392748124556 | -49 |
| 19.734392748124556 | -48 |
| 19.734392748124556 | -47 |
| 19.734392748124556 | -46 |
| 19.76277144889451 | -74 |
| 19.76277144889451 | -59 |
| 19.76277144889451 | -56 |
| 19.76277144889451 | -56 |
| 19.76277144889451 | -56 |
| 19.76277144889451 | -55 |
| 19.76277144889451 | -52 |
| 19.76277144889451 | -52 |
| 19.76277144889451 | -51 |
| 19.76277144889451 | -51 |
| 19.76277144889451 | -50 |
| 19.77902583360422 | -53 |
| 19.77902583360422 | -53 |
| 19.77902583360422 | -53 |
| 19.77902583360422 | -53 |
| 19.77902583360422 | -48 |
| 19.77902583360422 | -48 |
| 19.77902583360422 | -46 |
| 19.818199771034365 | -66 |
| 19.818199771034365 | -64 |
| 19.818199771034365 | -62 |
| 19.818199771034365 | -62 |
| 19.818199771034365 | -62 |
| 19.818199771034365 | -62 |
| 19.818199771034365 | -61 |
| 19.818199771034365 | -61 |
| 19.818199771034365 | -61 |
| 19.818199771034365 | -61 |
| 19.818199771034365 | -60 |
| 19.818199771034365 | -60 |
| 19.818199771034365 | -59 |
| 19.818199771034365 | -59 |
| 19.818199771034365 | -58 |
| 19.818199771034365 | -58 |
| 19.818199771034365 | -58 |
| 19.818199771034365 | -58 |
| 19.818199771034365 | -58 |
| 19.818199771034365 | -57 |
| 19.818199771034365 | -57 |
| 19.818199771034365 | -57 |
| 19.818199771034365 | -57 |
| 19.818199771034365 | -57 |
| 19.818199771034365 | -57 |
| 19.818199771034365 | -57 |
| 19.818199771034365 | -57 |
| 19.818199771034365 | -57 |
| 19.818199771034365 | -55 |
| 19.818199771034365 | -54 |
| 19.82369389514922 | -52 |
| 19.82369389514922 | -52 |
| 19.82369389514922 | -51 |
| 19.82369389514922 | -51 |
| 19.82369389514922 | -51 |
| 19.82369389514922 | -50 |
| 19.82369389514922 | -50 |
| 19.82369389514922 | -50 |
| 19.82369389514922 | -49 |
| 19.82369389514922 | -49 |
| 19.82369389514922 | -49 |
| 19.82369389514922 | -49 |
| 19.82369389514922 | -47 |
| 19.82369389514922 | -46 |
| 19.82369389514922 | -45 |
| 19.82369389514922 | -45 |
| 19.82369389514922 | -45 |
| 19.86947587602711 | -50 |
| 19.86947587602711 | -49 |
| 19.86947587602711 | -49 |
| 19.86947587602711 | -49 |
| 19.86947587602711 | -49 |
| 19.86947587602711 | -49 |
| 19.86947587602711 | -49 |
| 19.86947587602711 | -48 |
| 19.86947587602711 | -48 |
| 19.86947587602711 | -47 |
| 19.86947587602711 | -46 |
| 19.86947587602711 | -46 |
| 19.86947587602711 | -46 |
| 19.86947587602711 | -46 |
| 19.87415214753143 | -65 |
| 19.94455272794611 | -38 |
| 19.948263604039493 | -40 |
| 19.948263604039493 | -37 |
| 19.96981480306112 | -39 |
| 19.9768485677872 | -32 |
| 19.987611418226994 | -59 |
| 19.987611418226994 | -58 |
| 20.002045676326304 | -36 |
| 20.011800404771314 | -42 |
| 20.011800404771314 | -29 |
| 20.033315443817653 | -29 |
| 20.07042466430533 | -41 |
| 20.07042466430533 | -28 |
| 20.070504986440483 | -39 |
| 20.070504986440483 | -33 |
| 20.129361367881803 | -37 |
| 20.129361367881803 | -35 |
| 20.129361367881803 | -34 |
| 20.145742386884933 | -36 |
| 20.145742386884933 | -35 |
| 20.145742386884933 | -34 |
| 20.1625711248197 | -35 |
| 20.180253907507915 | -35 |
| 20.180253907507915 | -35 |
| 20.839064829103354 | -59 |
| 20.839064829103354 | -42 |
| 20.841076185666484 | -59 |
| 20.867141532893477 | -37 |
| 20.94040974852158 | -41 |
| 20.94040974852158 | -40 |
| 20.94040974852158 | -39 |
| 20.94040974852158 | -39 |
| 20.94040974852158 | -37 |
| 20.94040974852158 | -37 |
| 20.94040974852158 | -37 |
| 20.94040974852158 | -37 |
| 20.94040974852158 | -35 |
| 20.94040974852158 | -35 |
| 20.954099134713555 | -60 |
| 20.954099134713555 | -59 |
| 20.9548695667444 | -41 |
| 20.9548695667444 | -39 |
| 20.9548695667444 | -35 |
| 20.9548695667444 | -35 |
| 21.752070312970886 | -58 |
| 22.19953781759116 | -45 |
| 22.19953781759116 | -45 |
| 22.55432230104249 | -59 |
| 23.255305999349055 | -58 |
| 23.255305999349055 | -57 |
| 23.517257200444178 | -46 |
| 23.684586839015097 | -46 |
| 23.867631644469096 | -53 |
| 24.37972712618989 | -56 |
| 24.37972712618989 | -55 |
| 24.843109333462323 | -59 |
| 24.843109333462323 | -54 |
| 24.850239125864693 | -46 |
| 24.850239125864693 | -46 |
| 24.850239125864693 | -46 |
| 24.903191429554077 | -47 |
| 24.933968253390507 | -58 |
| 25.3745958486949 | -60 |
| 25.3745958486949 | -59 |
| 25.457214248533994 | -65 |
| 25.457214248533994 | -55 |
| 26.105934662748147 | -59 |
| 26.105934662748147 | -51 |
| 28.024558717836822 | -46 |
| 31.30652627065052 | -51 |
| 31.30652627065052 | -49 |
| 36.60348979713285 | -65 |
| 42.54771038811539 | -61 |
| 48.78669029365882 | -59 |
| 48.78669029365882 | -59 |
| 55.329558567180484 | -51 |
| 75.35088848269069 | -60 |
| 75.35088848269069 | -58 |
| 81.89353357112408 | -72 |
| 88.5667920870694 | -59 |
| 95.5032909890271 | -68 |
| 95.5032909890271 | -63 |
| 102.3615566741666 | -72 |
| 109.33983254334252 | -69 |
| 109.33983254334252 | -65 |
| 116.73576627421036 | -76 |
| 122.97793608636168 | -71 |
| 129.67226791909997 | -73 |
| 129.67226791909997 | -70 |
| 135.7510542635682 | -76 |
| 142.17822201994528 | -72 |
| 142.17822201994528 | -71 |
| 163.28005077186117 | -79 |
| 170.10418039261447 | -82 |
| 170.10418039261447 | -80 |
| 177.15215157478158 | -79 |
| 183.82404088688202 | -80 |
| 190.45403911686043 | -82 |
| 190.45403911686043 | -81 |
| 198.0714776035232 | -79 |
| 205.0200549922191 | -85 |
| 205.0200549922191 | -83 |
| 315.4111258079584 | -81 |
| 323.3297561471166 | -82 |
| 332.1153718123169 | -83 |
| 391.2238257952122 | -76 |
| 391.2238257952122 | -76 |
| 391.2238257952122 | -75 |
| 391.2238257952122 | -75 |
| 391.2238257952122 | -75 |
| 391.2238257952122 | -74 |
| 391.2238257952122 | -73 |
| 391.26308306157944 | -75 |
| 391.26308306157944 | -74 |
| 391.26308306157944 | -74 |
| 391.26308306157944 | -73 |
| 391.3385202946979 | -77 |
| 391.3385202946979 | -77 |
| 391.3385202946979 | -77 |
| 391.3385202946979 | -76 |
| 391.3385202946979 | -76 |
| 391.3385202946979 | -76 |
| 391.3385202946979 | -76 |
| 391.3385202946979 | -76 |
| 391.3385202946979 | -76 |
| 391.3385202946979 | -76 |
| 391.3385202946979 | -76 |
| 391.3385202946979 | -76 |
| 391.3385202946979 | -76 |
| 391.3385202946979 | -76 |
| 391.3385202946979 | -75 |
| 391.3385202946979 | -75 |
| 391.3385202946979 | -75 |
| 391.3385202946979 | -75 |
| 391.3385202946979 | -75 |
| 391.3385202946979 | -75 |
| 391.3385202946979 | -75 |
| 391.3385202946979 | -75 |
| 391.3385202946979 | -75 |
| 391.3385202946979 | -74 |
| 391.3385202946979 | -73 |
| 391.3777660280331 | -76 |
| 391.3777660280331 | -76 |
| 391.3777660280331 | -76 |
| 391.3777660280331 | -75 |
| 391.3777660280331 | -75 |
| 391.3777660280331 | -75 |
| 391.3777660280331 | -75 |
| 391.3777660280331 | -75 |
| 391.3777660280331 | -75 |
| 391.3777660280331 | -75 |
| 391.3777660280331 | -75 |
| 391.3777660280331 | -74 |
| 391.3777660280331 | -74 |
| 391.3777660280331 | -74 |
| 391.3777660280331 | -74 |
| 391.3777660280331 | -74 |
| 391.3777660280331 | -74 |
| 391.3777660280331 | -74 |
| 391.3777660280331 | -73 |
| 391.3777660280331 | -73 |
| 391.3777660280331 | -73 |
| 391.3777660280331 | -73 |
| 391.3777660280331 | -73 |
| 391.4938391272588 | -76 |
| 391.4938391272588 | -76 |
| 391.4938391272588 | -76 |
| 391.4938391272588 | -76 |
| 391.4938391272588 | -75 |
| 391.4938391272588 | -74 |
| 391.6099122628839 | -77 |
| 391.6099122628839 | -77 |
| 391.6099122628839 | -77 |
| 391.6099122628839 | -77 |
| 391.6099122628839 | -77 |
| 391.6099122628839 | -77 |
| 391.6099122628839 | -77 |
| 391.6099122628839 | -77 |
| 391.6099122628839 | -76 |
| 391.6099122628839 | -76 |
| 391.6099122628839 | -76 |
| 391.6099122628839 | -76 |
| 391.6099122628839 | -76 |
| 391.6099122628839 | -76 |
| 391.6099122628839 | -76 |
| 391.6099122628839 | -76 |
| 391.6099122628839 | -76 |
| 391.6099122628839 | -76 |
| 391.6099122628839 | -76 |
| 391.6099122628839 | -76 |
| 391.6099122628839 | -74 |
| 391.6099122628839 | -73 |
| 391.7259854348743 | -77 |
| 391.7259854348743 | -77 |
| 391.7259854348743 | -76 |
| 391.7259854348743 | -76 |
| 391.7259854348743 | -76 |
| 391.7259854348743 | -76 |
| 391.7259854348743 | -76 |
| 391.7259854348743 | -76 |
| 391.7259854348743 | -76 |
| 391.7259854348743 | -76 |
| 391.7259854348743 | -76 |
| 391.7259854348743 | -76 |
| 391.7259854348743 | -76 |
| 391.7259854348743 | -76 |
| 391.7259854348743 | -76 |
| 391.7259854348743 | -76 |
| 391.7259854348743 | -76 |
| 391.7259854348743 | -76 |
| 391.7259854348743 | -75 |
| 391.7259854348743 | -75 |
| 391.7259854348743 | -75 |
| 391.7259854348743 | -75 |
| 391.7259854348743 | -75 |
| 391.7259854348743 | -75 |
| 391.7259854348743 | -74 |
| 391.7259854348743 | -73 |
| 391.8420586431956 | -80 |
| 391.95813188781966 | -78 |
| 391.95813188781966 | -77 |
| 392.2658090011678 | -76 |
| 393.03129878088265 | -71 |
| 393.03129878088265 | -70 |
| 393.05324157585204 | -71 |
| 393.7064242835971 | -75 |
| 394.07410260158247 | -77 |
| 394.17014837153704 | -76 |
| 394.17014837153704 | -72 |
| 394.7303860652093 | -78 |
| 396.12162518603367 | -77 |
| 397.1475615406791 | -73 |
| 397.2365655089348 | -72 |
| 397.67669787737117 | -77 |
| 397.67669787737117 | -73 |
| 398.01809697446396 | -77 |
| 398.17608702303687 | -75 |
| 398.17608702303687 | -73 |
| 398.47744759225463 | -76 |
| 398.47744759225463 | -75 |
| 398.82178331131666 | -73 |
| 399.09106359209966 | -77 |
| 399.28545252873073 | -72 |
| 399.88706984327285 | -79 |
| 399.9818024940327 | -74 |
| 400.2260032548659 | -79 |
| 400.2260032548659 | -77 |
| 400.68427066507707 | -78 |
| 401.25908980384725 | -78 |
| 401.25908980384725 | -74 |
| 402.06642483093725 | -78 |
| 402.07750292888664 | -75 |
| 403.11117195276876 | -78 |
| 403.11117195276876 | -73 |
| 403.36072923430055 | -78 |
| 407.3195978234619 | -77 |
| 407.3195978234619 | -74 |
| 408.7226662715858 | -77 |
| 410.3448791652028 | -77 |
| 411.6334490816086 | -77 |
| 411.6334490816086 | -73 |
| 411.9555249115561 | -77 |
| 412.8953653001062 | -79 |
| 413.0247665271609 | -74 |
| 414.0677340659607 | -79 |
| 414.0677340659607 | -78 |
| 414.4310554725407 | -79 |
| 415.24245449788094 | -78 |
| 416.7757340286003 | -78 |
| 424.1388697928711 | -78 |
| 424.1388697928711 | -78 |
| 425.7851924339055 | -78 |
| 429.4035366292254 | -76 |
| 429.4035366292254 | -75 |
| 430.3048003826986 | -76 |
| 430.7052123346678 | -77 |
| 432.15658661589094 | -78 |
| 432.20995077629533 | -77 |
| 432.20995077629533 | -77 |
| 432.9677879395255 | -76 |
| 433.68936148378435 | -78 |
| 434.0362051271739 | -78 |
| 434.0362051271739 | -76 |
| 434.29574335978026 | -76 |
| 434.9574900202859 | -83 |
| 434.9574900202859 | -80 |
| 436.2254552926096 | -78 |
| 437.5314850725051 | -77 |
| 438.5744847394227 | -77 |
| 438.5744847394227 | -75 |
| 439.4198351601801 | -78 |
| 439.57214105476606 | -79 |
| 439.57214105476606 | -78 |
| 440.3596186444825 | -79 |
| 440.4613707406796 | -78 |
| 440.4613707406796 | -77 |
| 441.0547838090321 | -79 |
| 441.7715580158732 | -77 |
| 442.2372621808021 | -79 |
| 442.2372621808021 | -76 |
| 442.9290456663859 | -73 |
| 443.3058563912211 | -76 |
| 443.70083506948083 | -79 |
| 443.73845664353735 | -77 |
| 443.73845664353735 | -74 |
| 443.81475851162304 | -78 |
| 443.81475851162304 | -78 |
| 443.96383102911796 | -77 |
| 444.00783354354843 | -76 |
| 444.0873309749481 | -79 |
| 444.0873309749481 | -78 |
| 444.2584893184605 | -77 |
| 444.2584893184605 | -77 |
| 444.4353222931597 | -78 |
| 444.4991116567096 | -77 |
| 444.7456766747638 | -75 |
| 444.88058111480814 | -77 |
| 445.25812942082126 | -77 |
| 445.25812942082126 | -75 |
| 445.56544055797434 | -79 |
| 445.7539847104224 | -76 |
| 445.7879284122378 | -78 |
| 445.7879284122378 | -75 |
| 445.9039660256498 | -75 |
| 447.21304917847135 | -78 |
| 448.524234274158 | -78 |
| 448.524234274158 | -77 |
| 449.84804952111324 | -78 |
| 451.0658405639595 | -78 |
| 451.0658405639595 | -77 |
| 452.33841848979154 | -79 |
| 453.78823925054843 | -78 |
| 459.9126065189342 | -77 |
| 460.2152636825313 | -77 |
| 461.1853611221595 | -75 |
| 462.5747797850146 | -77 |
| 462.5747797850146 | -74 |
| 463.96351674780624 | -79 |
| 465.3515718782983 | -78 |
| 469.6806389327264 | -76 |
| 469.6806389327264 | -75 |
| 470.7703353620275 | -76 |
| 470.97538185243076 | -78 |
| 471.74611100072383 | -77 |
| 471.74611100072383 | -77 |
| 472.2439125259765 | -77 |
| 472.67077954298685 | -78 |
| 473.82801257938337 | -77 |
| 473.82801257938337 | -77 |
| 476.2126371728687 | -75 |
| 478.1229735583385 | -78 |
| 479.44923777494495 | -76 |
| 480.7219807164891 | -78 |
| 480.7219807164891 | -78 |
| 482.0486375769136 | -76 |
| 483.321263087636 | -77 |
| 484.76555720407305 | -77 |
| 484.76555720407305 | -75 |
| 486.0944679689321 | -76 |
| 487.36753438688044 | -78 |
| 487.36753438688044 | -77 |
| 488.5823372719944 | -78 |
| 489.66054585430203 | -77 |
| 491.24328977941565 | -76 |
| 491.7282846539921 | -78 |
| 501.9083468346799 | -75 |
| 508.6791344752075 | -76 |
| 512.9135695202544 | -78 |
| 513.8248685766365 | -76 |
| 515.6016675499507 | -79 |
| 523.1977688529236 | -76 |
| 527.3877290131156 | -77 |
| 528.9130284510638 | -77 |
| 528.9130284510638 | -77 |
| 530.2099261975034 | -78 |
| 531.1211079539148 | -78 |
| 531.1211079539148 | -77 |
| 531.3492538610684 | -77 |
| 531.3492538610684 | -77 |
| 531.3492538610684 | -77 |
| 531.3492538610684 | -77 |
| 531.3492538610684 | -77 |
| 531.3492538610684 | -77 |
| 531.3492538610684 | -77 |
| 531.3492538610684 | -77 |
| 531.4633281549347 | -79 |
| 531.4633281549347 | -78 |
| 531.4633281549347 | -77 |
| 531.4633281549347 | -77 |
| 531.4633281549347 | -77 |
| 531.4633281549347 | -77 |
| 531.4633281549347 | -77 |
| 531.4633281549347 | -77 |
| 531.4633281549347 | -76 |
| 532.077955468277 | -77 |
| 532.9882881720006 | -76 |
| 534.2878546310219 | -79 |
| 534.2878546310219 | -79 |
| 535.5867590849207 | -77 |
| 536.149801892654 | -76 |
| 536.3268586993739 | -77 |
| 536.3268586993739 | -77 |
| 538.8903025593164 | -77 |
| 538.8903025593164 | -75 |
| 540.191227585088 | -77 |
| 541.3814870602037 | -77 |
| 547.0872379992386 | -79 |
| 547.0872379992386 | -78 |
| 551.7605883062714 | -84 |
| 556.2334986581927 | -84 |
| 557.5751604932229 | -83 |
| 557.5751604932229 | -82 |
| 560.5282835069918 | -76 |
| 560.9173074163688 | -79 |
| 564.2691613205867 | -87 |
| 564.2954693294496 | -84 |
| 564.7321997891057 | -82 |
| 565.3225486005703 | -85 |
| 565.3777456515089 | -78 |
| 565.4249361474937 | -82 |
| 565.4249361474937 | -82 |
| 565.6490206838462 | -82 |
| 565.6954337401731 | -83 |
| 565.8291789340068 | -83 |
| 565.9676757017706 | -84 |
| 566.0459367723666 | -85 |
| 566.0459367723666 | -83 |
| 566.0973300162395 | -84 |
| 566.0973300162395 | -82 |
| 566.1111306496776 | -84 |
| 566.1352531058101 | -83 |
| 568.313285165782 | -78 |
| 570.8136701591596 | -84 |
| 571.3276530136693 | -80 |
| 571.4396365137411 | -79 |
| 571.5745356526501 | -83 |
| 572.2234766661579 | -76 |
| 574.706364523783 | -84 |
| 576.7127245067024 | -84 |
| 900.7696168610026 | -80 |
| 1167.0048330241727 | -82 |
| 1830.1997047135799 | -82 |
| 2224.1429323016177 | -81 |
| 2224.1429323016177 | -76 |
| 2258.831997596811 | -84 |
| 2316.89098530455 | -79 |
| 2320.501199977071 | -79 |
| 2320.501199977071 | -78 |
| 2320.7451112917383 | -79 |
| 2320.8014902819373 | -80 |
| 2320.8014902819373 | -80 |
| 2320.8014902819373 | -80 |
| 2320.8014902819373 | -80 |
| 2320.8014902819373 | -80 |
| 2320.8014902819373 | -80 |
| 2320.8014902819373 | -80 |
| 2320.8014902819373 | -80 |
| 2320.8014902819373 | -80 |
| 2320.8014902819373 | -80 |
| 2320.8014902819373 | -80 |
| 2320.8014902819373 | -80 |
| 2320.8014902819373 | -80 |
| 2320.8014902819373 | -80 |
| 2320.8014902819373 | -80 |
| 2320.8014902819373 | -80 |
| 2320.8014902819373 | -80 |
| 2320.8014902819373 | -79 |
| 2320.8014902819373 | -79 |
| 2320.8014902819373 | -79 |
| 2320.8014902819373 | -79 |
| 2320.8014902819373 | -79 |
| 2320.8014902819373 | -79 |
| 2320.8014902819373 | -79 |
| 2320.8014902819373 | -79 |
| 2320.8014902819373 | -79 |
| 2320.8014902819373 | -79 |
| 2320.8014902819373 | -79 |
| 2320.8014902819373 | -79 |
| 2320.8014902819373 | -79 |
| 2320.8014902819373 | -79 |
| 2320.8014902819373 | -79 |
| 2320.8014902819373 | -79 |
| 2320.8014902819373 | -79 |
| 2320.8014902819373 | -79 |
| 2320.8014902819373 | -79 |
| 2320.8014902819373 | -79 |
| 2320.8014902819373 | -79 |
| 2320.8014902819373 | -79 |
| 2320.8014902819373 | -79 |
| 2320.8014902819373 | -79 |
| 2320.8014902819373 | -79 |
| 2320.8014902819373 | -79 |
| 2320.8014902819373 | -79 |
| 2320.8014902819373 | -79 |
| 2320.8014902819373 | -79 |
| 2320.8014902819373 | -79 |
| 2320.8014902819373 | -79 |
| 2320.8014902819373 | -79 |
| 2320.8014902819373 | -79 |
| 2320.8014902819373 | -79 |
| 2320.8014902819373 | -79 |
| 2320.8014902819373 | -79 |
| 2320.8014902819373 | -79 |
| 2320.8014902819373 | -79 |
| 2320.8014902819373 | -79 |
| 2320.8014902819373 | -79 |
| 2320.8014902819373 | -79 |
| 2320.8014902819373 | -79 |
| 2320.8014902819373 | -79 |
| 2320.8014902819373 | -79 |
| 2320.8014902819373 | -79 |
| 2320.8014902819373 | -79 |
| 2320.8014902819373 | -79 |
| 2320.8014902819373 | -79 |
| 2320.8014902819373 | -79 |
| 2320.8014902819373 | -79 |
| 2320.8014902819373 | -79 |
| 2320.8014902819373 | -79 |
| 2320.8014902819373 | -79 |
| 2320.8014902819373 | -79 |
| 2320.8014902819373 | -79 |
| 2320.8014902819373 | -79 |
| 2320.8014902819373 | -79 |
| 2320.8014902819373 | -79 |
| 2320.8014902819373 | -79 |
| 2320.8014902819373 | -78 |
| 2320.8014902819373 | -78 |
| 2320.8014902819373 | -78 |
| 2320.8014902819373 | -78 |
| 2320.8014902819373 | -78 |
| 2320.8014902819373 | -78 |
| 2320.8014902819373 | -78 |
| 2320.8014902819373 | -78 |
| 2320.8014902819373 | -78 |
| 2320.8014902819373 | -78 |
| 2320.8014902819373 | -78 |
| 2320.8014902819373 | -78 |
| 2320.8014902819373 | -78 |
| 2320.8014902819373 | -77 |
| 2320.8014902819373 | -77 |
| 2320.8578737115713 | -80 |
| 2320.8578737115713 | -80 |
| 2320.8578737115713 | -80 |
| 2320.8578737115713 | -80 |
| 2320.8578737115713 | -80 |
| 2320.8578737115713 | -80 |
| 2320.8578737115713 | -80 |
| 2320.8578737115713 | -79 |
| 2320.8578737115713 | -79 |
| 2320.8578737115713 | -79 |
| 2320.8578737115713 | -79 |
| 2320.8578737115713 | -79 |
| 2320.8578737115713 | -79 |
| 2320.8578737115713 | -79 |
| 2320.8578737115713 | -79 |
| 2320.8578737115713 | -79 |
| 2320.8578737115713 | -79 |
| 2320.8578737115713 | -79 |
| 2320.8578737115713 | -79 |
| 2320.8578737115713 | -79 |
| 2320.8578737115713 | -79 |
| 2320.8578737115713 | -79 |
| 2320.8578737115713 | -79 |
| 2320.8578737115713 | -79 |
| 2320.8578737115713 | -79 |
| 2320.8578737115713 | -79 |
| 2320.8578737115713 | -79 |
| 2320.8578737115713 | -79 |
| 2320.8578737115713 | -79 |
| 2320.8578737115713 | -79 |
| 2320.8578737115713 | -79 |
| 2320.8578737115713 | -79 |
| 2320.8578737115713 | -79 |
| 2320.8578737115713 | -79 |
| 2320.8578737115713 | -79 |
| 2320.8578737115713 | -79 |
| 2320.8578737115713 | -79 |
| 2320.8578737115713 | -79 |
| 2320.8578737115713 | -79 |
| 2320.8578737115713 | -79 |
| 2320.8578737115713 | -79 |
| 2320.8578737115713 | -79 |
| 2320.8578737115713 | -79 |
| 2320.8578737115713 | -79 |
| 2320.8578737115713 | -79 |
| 2320.8578737115713 | -79 |
| 2320.8578737115713 | -79 |
| 2320.8578737115713 | -79 |
| 2320.8578737115713 | -79 |
| 2320.8578737115713 | -79 |
| 2320.8578737115713 | -79 |
| 2320.8578737115713 | -79 |
| 2320.8578737115713 | -79 |
| 2320.8578737115713 | -79 |
| 2320.8578737115713 | -79 |
| 2320.8578737115713 | -79 |
| 2320.8578737115713 | -78 |
| 2320.8578737115713 | -78 |
| 2320.8578737115713 | -78 |
| 2320.8578737115713 | -78 |
| 2320.8578737115713 | -78 |
| 2320.8578737115713 | -78 |
| 2320.8578737115713 | -78 |
| 2320.8578737115713 | -78 |
| 2320.8578737115713 | -78 |
| 2320.8578737115713 | -78 |
| 2320.8578737115713 | -78 |
| 2320.8578737115713 | -78 |
| 2320.8578737115713 | -78 |
| 2320.8578737115713 | -78 |
| 2320.8578737115713 | -78 |
| 2320.8578737115713 | -78 |
| 2320.8578737115713 | -78 |
| 2320.8578737115713 | -78 |
| 2320.8578737115713 | -78 |
| 2320.8578737115713 | -78 |
| 2320.8578737115713 | -78 |
| 2320.8578737115713 | -78 |
| 2320.8578737115713 | -78 |
| 2320.8578737115713 | -78 |
| 2320.8578737115713 | -78 |
| 2320.8578737115713 | -78 |
| 2320.8578737115713 | -77 |
| 2320.8578737115713 | -77 |
| 2320.8578737115713 | -77 |
| 2320.8578737115713 | -77 |
| 2320.8578737115713 | -76 |
| 2320.869146680138 | -81 |
| 2320.869146680138 | -80 |
| 2320.9142615803194 | -81 |
| 2320.9142615803194 | -80 |
| 2320.9142615803194 | -80 |
| 2320.9142615803194 | -80 |
| 2320.9142615803194 | -80 |
| 2320.9142615803194 | -80 |
| 2320.9142615803194 | -80 |
| 2320.9142615803194 | -80 |
| 2320.9142615803194 | -80 |
| 2320.9142615803194 | -80 |
| 2320.9142615803194 | -80 |
| 2320.9142615803194 | -80 |
| 2320.9142615803194 | -79 |
| 2320.9142615803194 | -79 |
| 2320.9142615803194 | -79 |
| 2320.9142615803194 | -79 |
| 2320.9142615803194 | -79 |
| 2320.9142615803194 | -79 |
| 2320.9142615803194 | -79 |
| 2320.9142615803194 | -79 |
| 2320.9142615803194 | -79 |
| 2320.9142615803194 | -79 |
| 2320.9142615803194 | -79 |
| 2320.9142615803194 | -79 |
| 2320.9142615803194 | -79 |
| 2320.9142615803194 | -79 |
| 2320.9142615803194 | -79 |
| 2320.9142615803194 | -78 |
| 2320.9142615803194 | -78 |
| 2320.9142615803194 | -77 |
| 2320.9706538878568 | -79 |
| 2320.9706538878568 | -79 |
| 2320.9706538878568 | -78 |
| 2322.0315652396143 | -84 |
| 2322.154487463254 | -83 |
| 2322.322355109218 | -82 |
| 2322.614389818929 | -82 |
| 2323.1906420997284 | -82 |
| 2323.915732142988 | -83 |
| 2347.0093110159382 | -81 |
| 4663.060344897855 | -81 |